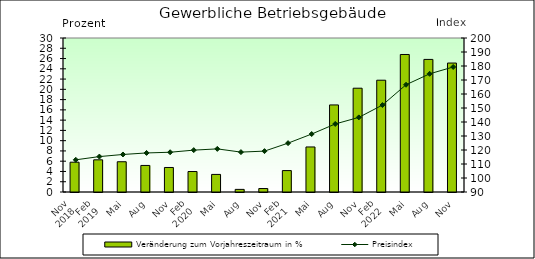
| Category | Veränderung zum Vorjahreszeitraum in % |
|---|---|
| 0 | 5.805 |
| 1 | 6.267 |
| 2 | 5.893 |
| 3 | 5.174 |
| 4 | 4.779 |
| 5 | 3.99 |
| 6 | 3.425 |
| 7 | 0.509 |
| 8 | 0.676 |
| 9 | 4.17 |
| 10 | 8.775 |
| 11 | 16.962 |
| 12 | 20.218 |
| 13 | 21.777 |
| 14 | 26.788 |
| 15 | 25.83 |
| 16 | 25.122 |